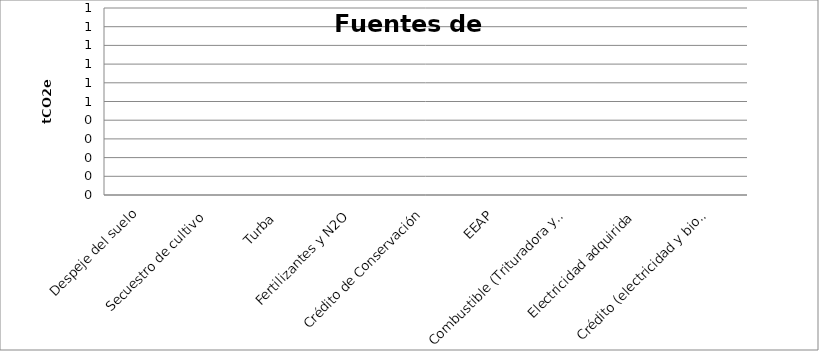
| Category | tCO2e |
|---|---|
| Despeje del suelo | 0 |
| Secuestro de cultivo | 0 |
| Turba  | 0 |
| Fertilizantes y N2O | 0 |
| Crédito de Conservación | 0 |
| EEAP | 0 |
| Combustible (Trituradora y campo) | 0 |
| Electricidad adquirida  | 0 |
| Crédito (electricidad y biomasa) | 0 |